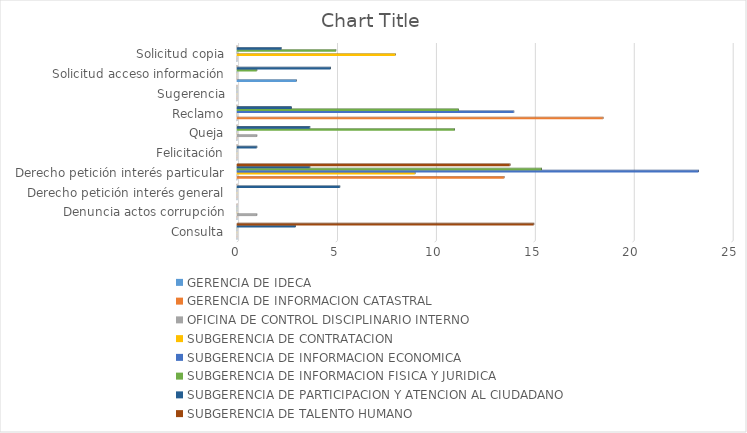
| Category | GERENCIA DE IDECA | GERENCIA DE INFORMACION CATASTRAL | OFICINA DE CONTROL DISCIPLINARIO INTERNO | SUBGERENCIA DE CONTRATACION | SUBGERENCIA DE INFORMACION ECONOMICA | SUBGERENCIA DE INFORMACION FISICA Y JURIDICA | SUBGERENCIA DE PARTICIPACION Y ATENCION AL CIUDADANO | SUBGERENCIA DE TALENTO HUMANO |
|---|---|---|---|---|---|---|---|---|
| Consulta | 0 | 0 | 0 | 0 | 0 | 0 | 2.95 | 15 |
| Denuncia actos corrupción | 0 | 0 | 1 | 0 | 0 | 0 | 0 | 0 |
| Derecho petición interés general | 0 | 0 | 0 | 0 | 0 | 0 | 5.2 | 0 |
| Derecho petición interés particular | 0 | 13.5 | 0 | 9 | 23.33 | 15.4 | 3.69 | 13.8 |
| Felicitación | 0 | 0 | 0 | 0 | 0 | 0 | 1 | 0 |
| Queja | 0 | 0 | 1 | 0 | 0 | 11 | 3.69 | 0 |
| Reclamo | 0 | 18.5 | 0 | 0 | 14 | 11.19 | 2.75 | 0 |
| Sugerencia | 0 | 0 | 0 | 0 | 0 | 0 | 0 | 0 |
| Solicitud acceso información | 3 | 0 | 0 | 0 | 0 | 1 | 4.73 | 0 |
| Solicitud copia | 0 | 0 | 0 | 8 | 0 | 5 | 2.25 | 0 |